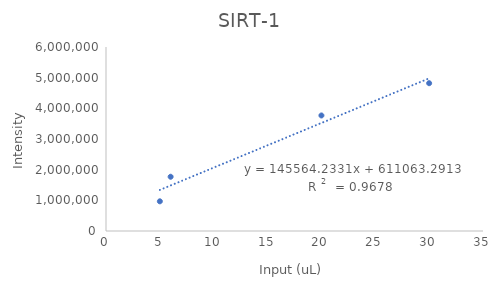
| Category | Series 0 |
|---|---|
| 20.0 | 3767332 |
| 5.0 | 967975.937 |
| 30.0 | 4819628.4 |
| 6.0 | 1768735.045 |